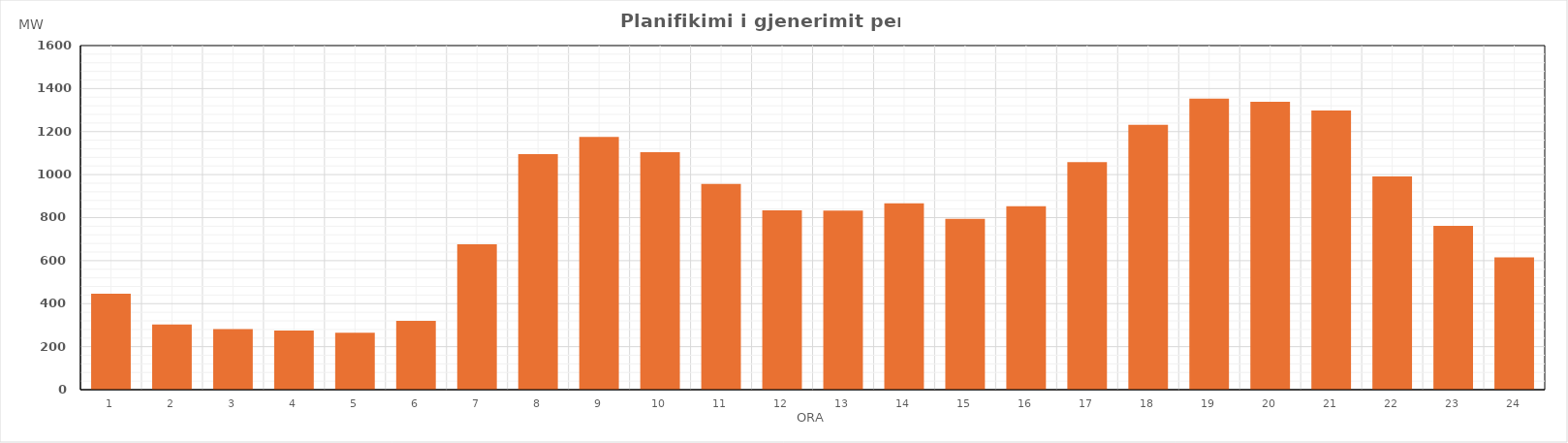
| Category | Max (MW) |
|---|---|
| 0 | 446.47 |
| 1 | 302.71 |
| 2 | 281.92 |
| 3 | 275.25 |
| 4 | 264.97 |
| 5 | 320.52 |
| 6 | 675.53 |
| 7 | 1095.7 |
| 8 | 1175.18 |
| 9 | 1104.18 |
| 10 | 956.91 |
| 11 | 833.77 |
| 12 | 832.96 |
| 13 | 866.47 |
| 14 | 794.73 |
| 15 | 852.55 |
| 16 | 1058.08 |
| 17 | 1231.96 |
| 18 | 1353.5 |
| 19 | 1338.41 |
| 20 | 1298.43 |
| 21 | 991.9 |
| 22 | 761.61 |
| 23 | 614.91 |